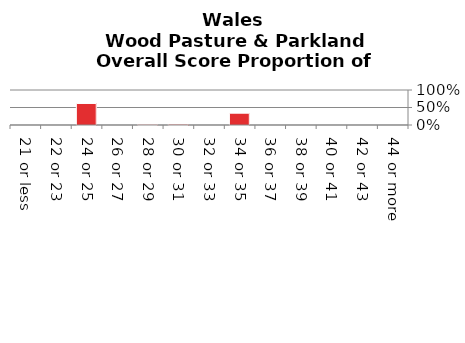
| Category | Wood Pasture & Parkland |
|---|---|
| 21 or less | 0 |
| 22 or 23 | 0 |
| 24 or 25 | 0.615 |
| 26 or 27 | 0 |
| 28 or 29 | 0.022 |
| 30 or 31 | 0.025 |
| 32 or 33 | 0 |
| 34 or 35 | 0.337 |
| 36 or 37 | 0 |
| 38 or 39 | 0 |
| 40 or 41 | 0 |
| 42 or 43 | 0 |
| 44 or more | 0 |